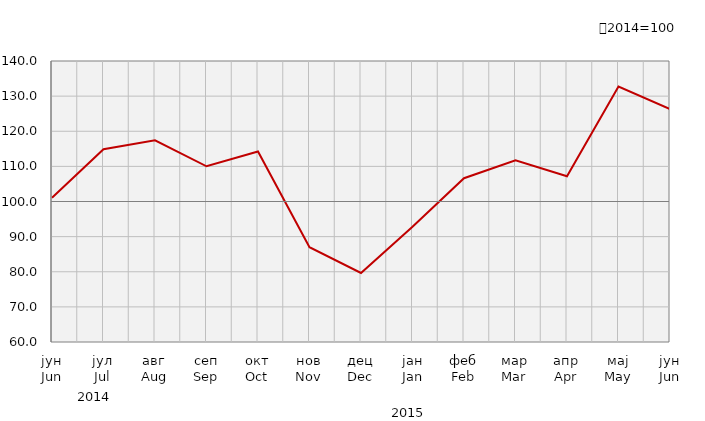
| Category | Индекси ноћења туриста
Tourist night indices |
|---|---|
| јун
Jun | 101.092 |
| јул
Jul | 114.875 |
| авг
Aug | 117.438 |
| сеп
Sep | 110.023 |
| окт
Oct | 114.25 |
| нов
Nov | 86.993 |
| дец
Dec | 79.66 |
| јан
Jan | 92.8 |
| феб
Feb | 106.635 |
| мар
Mar | 111.734 |
| апр
Apr | 107.182 |
| мај
May | 132.731 |
| јун
Jun | 126.332 |